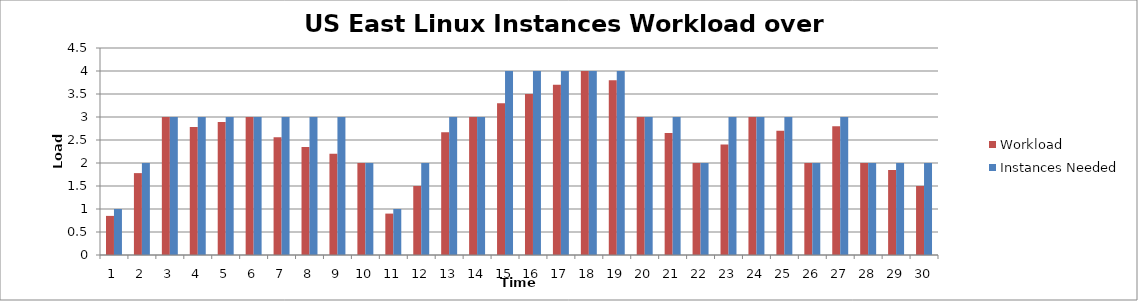
| Category | Workload | Instances Needed |
|---|---|---|
| 0 | 0.85 | 1 |
| 1 | 1.78 | 2 |
| 2 | 3 | 3 |
| 3 | 2.78 | 3 |
| 4 | 2.89 | 3 |
| 5 | 3 | 3 |
| 6 | 2.56 | 3 |
| 7 | 2.35 | 3 |
| 8 | 2.2 | 3 |
| 9 | 2 | 2 |
| 10 | 0.9 | 1 |
| 11 | 1.5 | 2 |
| 12 | 2.67 | 3 |
| 13 | 3 | 3 |
| 14 | 3.3 | 4 |
| 15 | 3.5 | 4 |
| 16 | 3.7 | 4 |
| 17 | 4 | 4 |
| 18 | 3.8 | 4 |
| 19 | 3 | 3 |
| 20 | 2.65 | 3 |
| 21 | 2 | 2 |
| 22 | 2.4 | 3 |
| 23 | 3 | 3 |
| 24 | 2.7 | 3 |
| 25 | 2 | 2 |
| 26 | 2.8 | 3 |
| 27 | 2 | 2 |
| 28 | 1.85 | 2 |
| 29 | 1.5 | 2 |